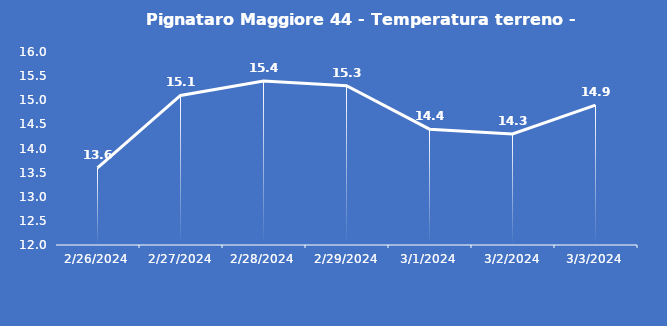
| Category | Pignataro Maggiore 44 - Temperatura terreno - Grezzo (°C) |
|---|---|
| 2/26/24 | 13.6 |
| 2/27/24 | 15.1 |
| 2/28/24 | 15.4 |
| 2/29/24 | 15.3 |
| 3/1/24 | 14.4 |
| 3/2/24 | 14.3 |
| 3/3/24 | 14.9 |